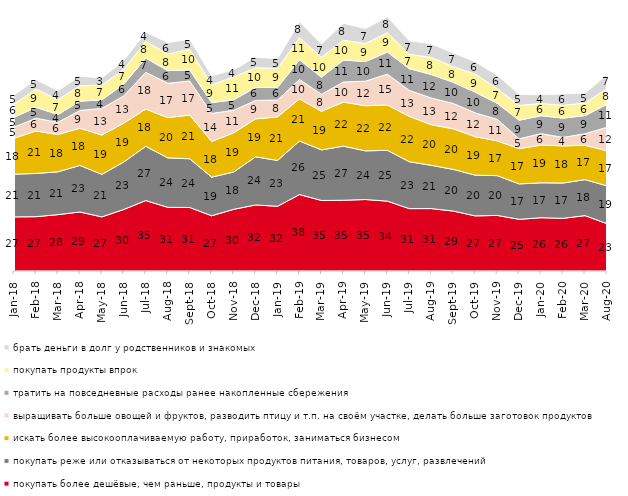
| Category | покупать более дешёвые, чем раньше, продукты и товары | покупать реже или отказываться от некоторых продуктов питания, товаров, услуг, развлечений | искать более высокооплачиваемую работу, приработок, заниматься бизнесом | выращивать больше овощей и фруктов, разводить птицу и т.п. на своём участке, делать больше заготовок продуктов  | тратить на повседневные расходы ранее накопленные сбережения | покупать продукты впрок | брать деньги в долг у родственников и знакомых |
|---|---|---|---|---|---|---|---|
| 2018-01-01 | 26.55 | 20.95 | 17.6 | 5.45 | 4.85 | 6.35 | 4.55 |
| 2018-02-01 | 26.65 | 21.2 | 20.85 | 6.25 | 5.35 | 9 | 4.6 |
| 2018-03-01 | 27.65 | 21 | 18.3 | 5.95 | 3.85 | 7.35 | 4.35 |
| 2018-04-01 | 28.95 | 22.85 | 18.25 | 8.7 | 4.55 | 7.55 | 4.7 |
| 2018-05-01 | 26.55 | 20.85 | 19.3 | 13.05 | 4.2 | 7.25 | 3.45 |
| 2018-06-01 | 30.2 | 23.3 | 19.05 | 13.35 | 5.8 | 7.2 | 4.45 |
| 2018-07-01 | 34.55 | 26.6 | 18.3 | 18.05 | 6.95 | 8.25 | 4.4 |
| 2018-08-01 | 31.25 | 24.25 | 19.75 | 16.85 | 6.2 | 8.15 | 5.65 |
| 2018-09-01 | 31.15 | 23.9 | 21.45 | 16.7 | 5.45 | 10.1 | 4.95 |
| 2018-10-01 | 27.1 | 18.95 | 17.5 | 13.75 | 5.3 | 8.8 | 4.35 |
| 2018-11-01 | 30.24 | 18.313 | 19.212 | 11.078 | 5.14 | 11.178 | 3.543 |
| 2018-12-01 | 32.4 | 23.6 | 18.65 | 9.05 | 6.35 | 9.7 | 5.15 |
| 2019-01-01 | 31.75 | 22.5 | 21.35 | 8.25 | 6.25 | 9.25 | 4.8 |
| 2019-02-01 | 37.5 | 26.25 | 20.7 | 9.5 | 9.7 | 10.95 | 7.65 |
| 2019-03-01 | 34.61 | 24.814 | 18.896 | 8.354 | 8.404 | 9.697 | 6.564 |
| 2019-04-01 | 34.703 | 26.535 | 21.634 | 9.851 | 10.743 | 9.752 | 8.317 |
| 2019-05-01 | 35.067 | 23.873 | 22.14 | 12.036 | 9.658 | 8.816 | 7.33 |
| 2019-06-01 | 34.264 | 24.938 | 22.244 | 15.112 | 10.873 | 9.476 | 7.781 |
| 2019-07-01 | 30.594 | 23.02 | 22.228 | 12.723 | 10.693 | 7.03 | 6.683 |
| 2019-08-01 | 30.619 | 21.229 | 19.93 | 13.087 | 11.538 | 8.392 | 6.643 |
| 2019-09-01 | 29.406 | 20.446 | 19.901 | 12.426 | 10.396 | 7.673 | 6.733 |
| 2019-10-01 | 27.03 | 20 | 18.861 | 11.683 | 10.149 | 8.861 | 6.089 |
| 2019-11-01 | 27.277 | 19.505 | 17.079 | 10.545 | 7.871 | 7.277 | 6.436 |
| 2019-12-01 | 25.347 | 17.376 | 17.277 | 4.851 | 9.109 | 7.277 | 5.446 |
| 2020-01-01 | 26.139 | 17.129 | 18.515 | 5.594 | 8.812 | 6.04 | 4.257 |
| 2020-02-01 | 25.842 | 17.327 | 18.218 | 4.158 | 9.455 | 6.287 | 5.594 |
| 2020-03-01 | 27.169 | 17.65 | 16.857 | 5.652 | 8.924 | 6.148 | 4.859 |
| 2020-08-01 | 23.188 | 18.57 | 17.229 | 11.519 | 11.271 | 7.746 | 6.753 |